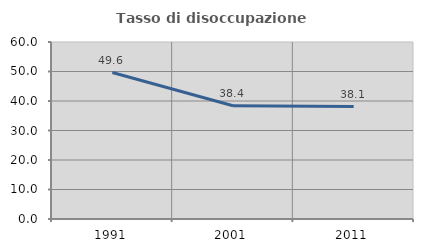
| Category | Tasso di disoccupazione giovanile  |
|---|---|
| 1991.0 | 49.645 |
| 2001.0 | 38.384 |
| 2011.0 | 38.095 |